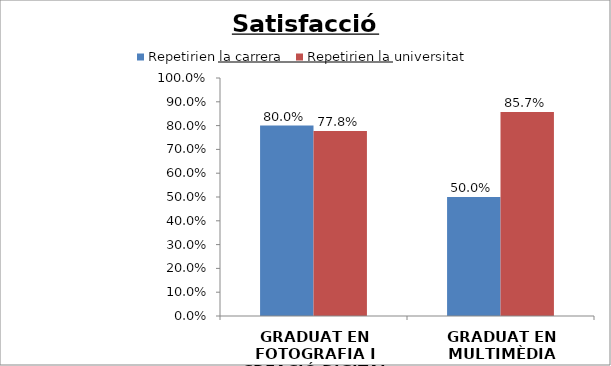
| Category | Repetirien la carrera | Repetirien la universitat |
|---|---|---|
| GRADUAT EN FOTOGRAFIA I CREACIÓ DIGITAL | 0.8 | 0.778 |
| GRADUAT EN MULTIMÈDIA | 0.5 | 0.857 |